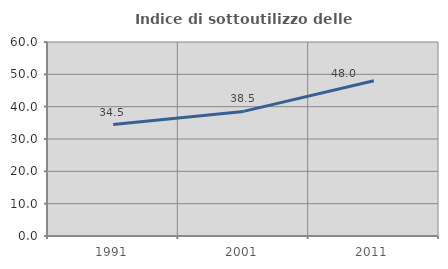
| Category | Indice di sottoutilizzo delle abitazioni  |
|---|---|
| 1991.0 | 34.478 |
| 2001.0 | 38.54 |
| 2011.0 | 47.994 |